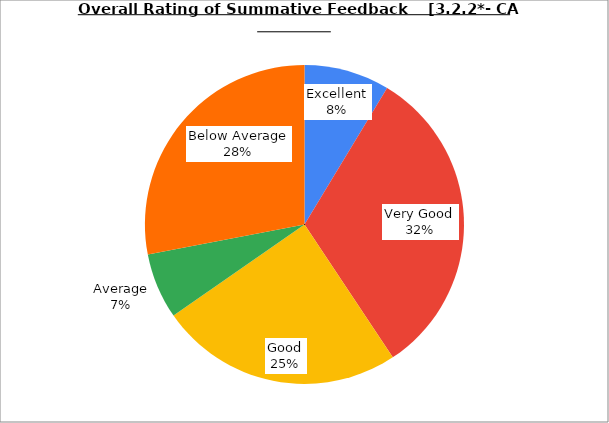
| Category | Series 0 |
|---|---|
| Excellent | 8.667 |
| Very Good | 32 |
| Good | 24.667 |
| Average | 6.667 |
| Below Average | 28 |